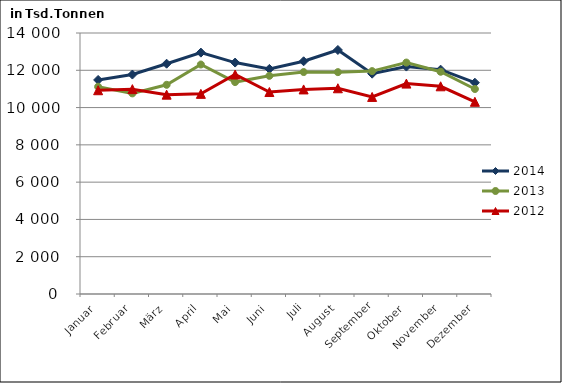
| Category | 2014 | 2013 | 2012 |
|---|---|---|---|
| Januar | 11483.064 | 11119.399 | 10930.193 |
| Februar | 11771.027 | 10760.95 | 10988.258 |
| März | 12352.884 | 11221.318 | 10692.464 |
| April | 12947.646 | 12309.663 | 10735.21 |
| Mai | 12413.614 | 11367.286 | 11773.32 |
| Juni | 12074.912 | 11702.924 | 10833.616 |
| Juli | 12482.909 | 11905.804 | 10973.372 |
| August | 13089.657 | 11900.761 | 11035.258 |
| September | 11818.844 | 11955.163 | 10571.178 |
| Oktober | 12198.116 | 12414.086 | 11285.846 |
| November | 12033.776 | 11920.704 | 11140.971 |
| Dezember | 11333.697 | 10995.382 | 10309.711 |